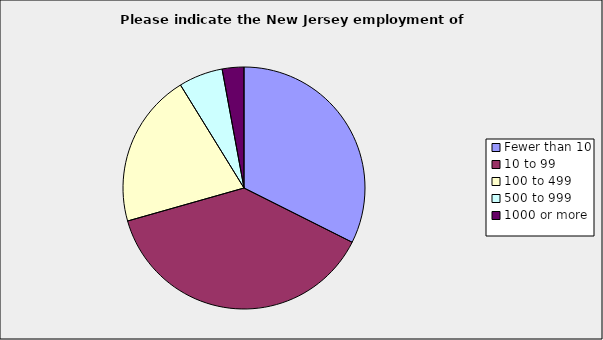
| Category | Series 0 |
|---|---|
| Fewer than 10 | 0.324 |
| 10 to 99 | 0.382 |
| 100 to 499 | 0.206 |
| 500 to 999 | 0.059 |
| 1000 or more | 0.029 |